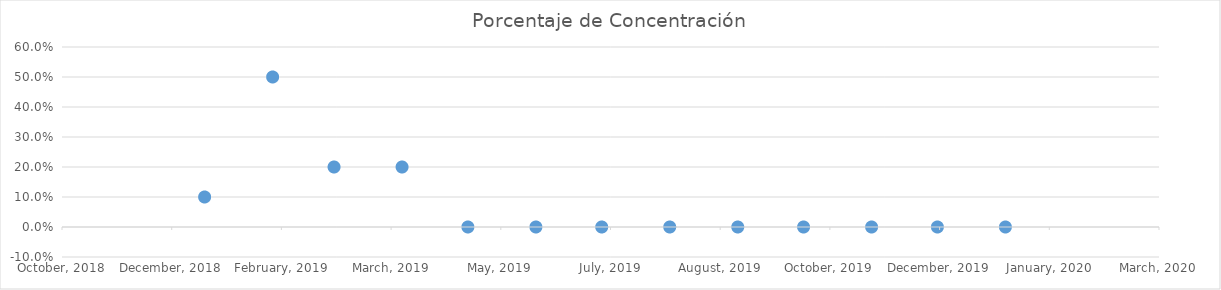
| Category | Porcentaje de Concentración |
|---|---|
| 43465.0 | 0.1 |
| 43496.0 | 0.5 |
| 43524.0 | 0.2 |
| 43555.0 | 0.2 |
| 43585.0 | 0 |
| 43616.0 | 0 |
| 43646.0 | 0 |
| 43677.0 | 0 |
| 43708.0 | 0 |
| 43738.0 | 0 |
| 43769.0 | 0 |
| 43799.0 | 0 |
| 43830.0 | 0 |